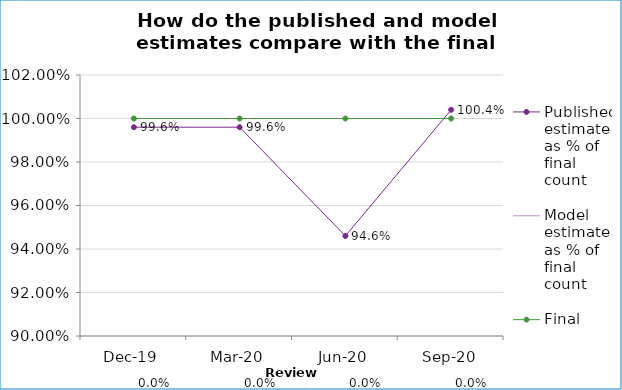
| Category | Published estimate as % of final count | Model estimate as % of final count   | Final count (100%) |
|---|---|---|---|
| 2019-12-01 | 0.996 |  | 1 |
| 2020-03-01 | 0.996 |  | 1 |
| 2020-06-01 | 0.946 |  | 1 |
| 2020-09-01 | 1.004 |  | 1 |